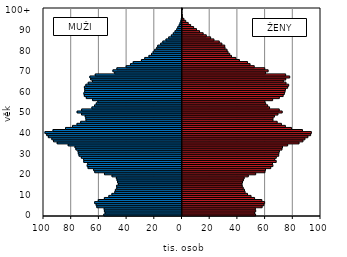
| Category | -5 176 927  | 5 361 348  |
|---|---|---|
| 0 | -56454 | 53489 |
| 1 | -55476 | 52797 |
| 2 | -56018 | 53573 |
| 3 | -56192 | 53328 |
| 4 | -61500 | 58242 |
| 5 | -61979 | 59536 |
| 6 | -63038 | 60008 |
| 7 | -60443 | 58030 |
| 8 | -56044 | 52779 |
| 9 | -52824 | 50223 |
| 10 | -50619 | 47687 |
| 11 | -48527 | 45927 |
| 12 | -48094 | 45494 |
| 13 | -47105 | 44594 |
| 14 | -47152 | 43873 |
| 15 | -45917 | 43689 |
| 16 | -46476 | 44050 |
| 17 | -46864 | 44656 |
| 18 | -47384 | 45274 |
| 19 | -50523 | 48250 |
| 20 | -55968 | 53573 |
| 21 | -62992 | 60275 |
| 22 | -63806 | 60657 |
| 23 | -67827 | 64448 |
| 24 | -68441 | 66002 |
| 25 | -68034 | 65666 |
| 26 | -70923 | 68379 |
| 27 | -71013 | 67273 |
| 28 | -72679 | 68443 |
| 29 | -74352 | 70177 |
| 30 | -74856 | 70308 |
| 31 | -75088 | 70670 |
| 32 | -76571 | 72534 |
| 33 | -77230 | 72931 |
| 34 | -82166 | 76648 |
| 35 | -90105 | 84885 |
| 36 | -92746 | 87714 |
| 37 | -93978 | 89134 |
| 38 | -96485 | 91264 |
| 39 | -97684 | 93235 |
| 40 | -98937 | 93763 |
| 41 | -93133 | 87342 |
| 42 | -84088 | 79453 |
| 43 | -79044 | 75005 |
| 44 | -75813 | 72151 |
| 45 | -73154 | 69098 |
| 46 | -69315 | 66058 |
| 47 | -69452 | 66081 |
| 48 | -69881 | 67094 |
| 49 | -72517 | 69640 |
| 50 | -75703 | 72721 |
| 51 | -72464 | 70587 |
| 52 | -65044 | 63579 |
| 53 | -63107 | 62200 |
| 54 | -61895 | 60793 |
| 55 | -60770 | 60237 |
| 56 | -64547 | 65814 |
| 57 | -69100 | 70641 |
| 58 | -70510 | 73412 |
| 59 | -70819 | 74264 |
| 60 | -70234 | 74766 |
| 61 | -70220 | 75056 |
| 62 | -70464 | 76643 |
| 63 | -69413 | 77392 |
| 64 | -67705 | 75462 |
| 65 | -64579 | 73543 |
| 66 | -65883 | 75266 |
| 67 | -66513 | 78140 |
| 68 | -62637 | 75199 |
| 69 | -48587 | 60704 |
| 70 | -49860 | 62566 |
| 71 | -47031 | 60117 |
| 72 | -40304 | 52516 |
| 73 | -37216 | 49515 |
| 74 | -35227 | 47691 |
| 75 | -29293 | 41827 |
| 76 | -26905 | 39282 |
| 77 | -23869 | 36122 |
| 78 | -22040 | 34819 |
| 79 | -20850 | 33607 |
| 80 | -19686 | 32883 |
| 81 | -18228 | 31452 |
| 82 | -17509 | 31231 |
| 83 | -15372 | 29141 |
| 84 | -13834 | 27263 |
| 85 | -11573 | 23437 |
| 86 | -9609 | 21045 |
| 87 | -7699 | 17898 |
| 88 | -6290 | 15638 |
| 89 | -5045 | 13025 |
| 90 | -3795 | 10842 |
| 91 | -3031 | 8772 |
| 92 | -2076 | 6621 |
| 93 | -1453 | 4855 |
| 94 | -867 | 3062 |
| 95 | -510 | 1764 |
| 96 | -196 | 708 |
| 97 | -129 | 555 |
| 98 | -96 | 356 |
| 99 | -60 | 294 |
| 100+ | -173 | 625 |